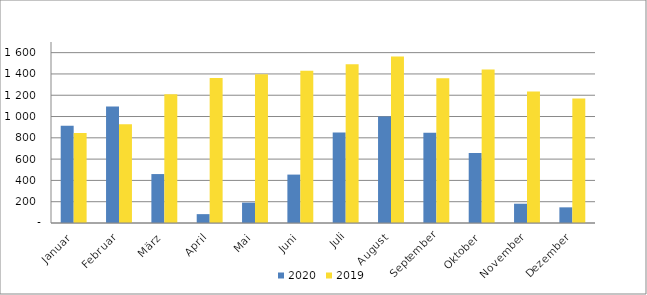
| Category | 2020 | 2019 |
|---|---|---|
| Januar | 914276 | 845707 |
| Februar | 1093332 | 926907 |
| März | 459653 | 1209249 |
| April | 83224 | 1361223 |
| Mai | 191489 | 1396422 |
| Juni | 454669 | 1429918 |
| Juli | 850076 | 1490543 |
| August | 999664 | 1563959 |
| September | 847725 | 1359152 |
| Oktober | 656323 | 1440795 |
| November | 181089 | 1234146 |
| Dezember | 147093 | 1169385 |